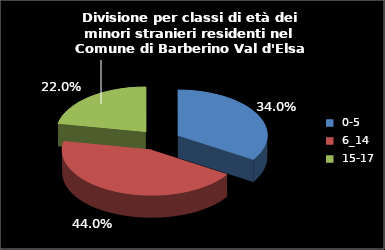
| Category | Series 0 |
|---|---|
| 0-5 | 17 |
| 6_14 | 22 |
| 15-17 | 11 |